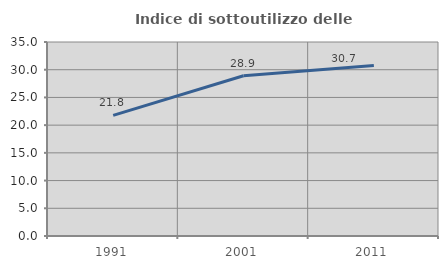
| Category | Indice di sottoutilizzo delle abitazioni  |
|---|---|
| 1991.0 | 21.765 |
| 2001.0 | 28.912 |
| 2011.0 | 30.75 |